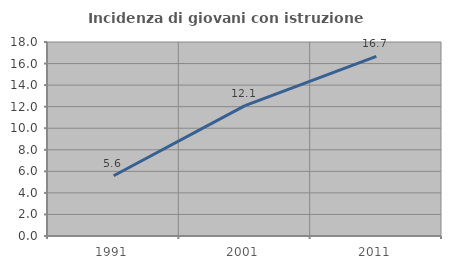
| Category | Incidenza di giovani con istruzione universitaria |
|---|---|
| 1991.0 | 5.587 |
| 2001.0 | 12.097 |
| 2011.0 | 16.667 |